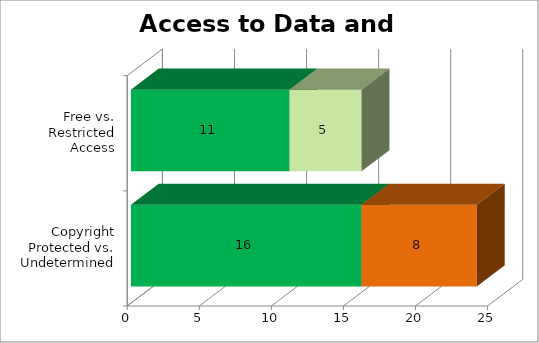
| Category | Series 0 | Series 1 |
|---|---|---|
| Copyright Protected vs. Undetermined | 16 | 8 |
| Free vs. Restricted Access | 11 | 5 |